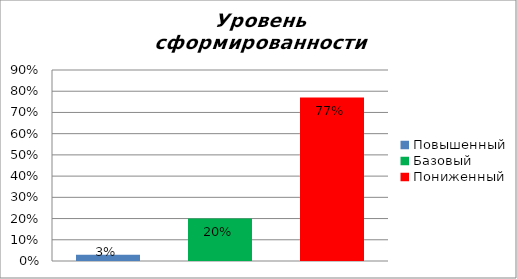
| Category | Уровень сформированности предметных результатов |
|---|---|
| Повышенный | 0.03 |
| Базовый | 0.2 |
| Пониженный | 0.77 |